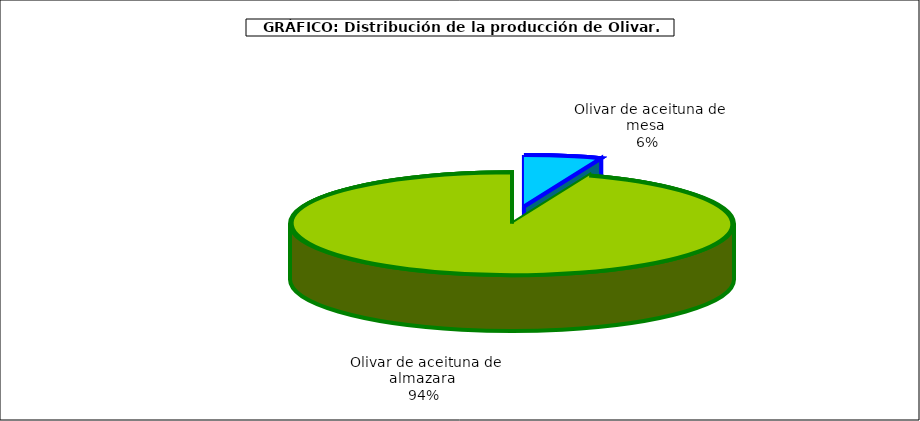
| Category | Series 0 |
|---|---|
| Olivar de aceituna de mesa | 555033 |
| Olivar de aceituna de almazara | 9264536 |